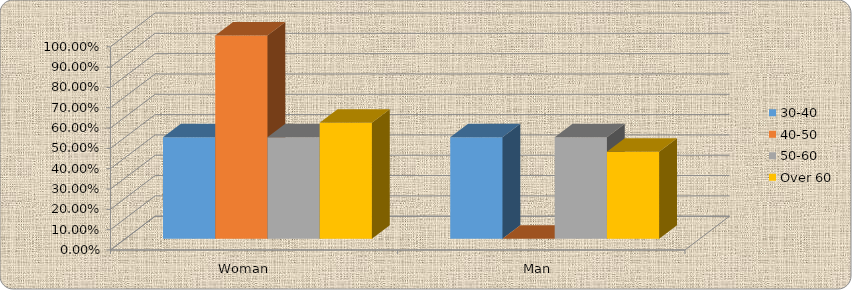
| Category | 30-40 | 40-50 | 50-60 | Over 60 |
|---|---|---|---|---|
| Woman     | 0.5 | 1 | 0.5 | 0.571 |
| Man  | 0.5 | 0 | 0.5 | 0.429 |